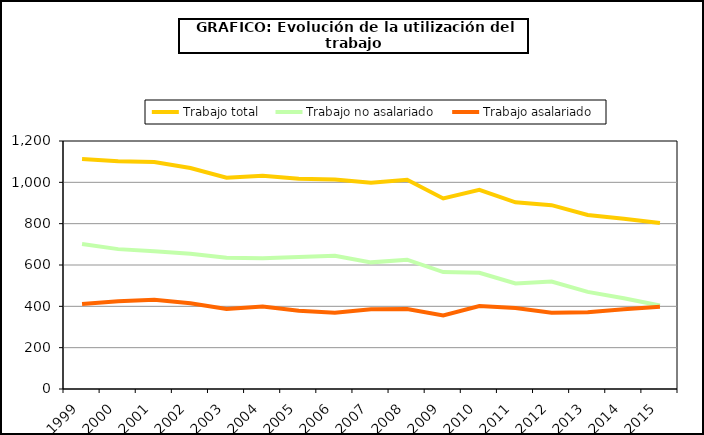
| Category | Trabajo total | Trabajo no asalariado | Trabajo asalariado |
|---|---|---|---|
| 1999.0 | 1112.739 | 701.172 | 411.567 |
| 2000.0 | 1101.451 | 676.79 | 424.661 |
| 2001.0 | 1098.738 | 666.463 | 432.275 |
| 2002.0 | 1069.314 | 654.029 | 415.285 |
| 2003.0 | 1022.665 | 635.076 | 387.589 |
| 2004.0 | 1032.156 | 632.785 | 399.371 |
| 2005.0 | 1017.234 | 638.883 | 378.351 |
| 2006.0 | 1013.286 | 644.545 | 368.741 |
| 2007.0 | 998.234 | 612.743 | 385.491 |
| 2008.0 | 1012.396 | 625.532 | 386.864 |
| 2009.0 | 922.026 | 565.965 | 356.062 |
| 2010.0 | 963.769 | 562.528 | 401.241 |
| 2011.0 | 903.306 | 510.941 | 392.364 |
| 2012.0 | 889.651 | 520.158 | 369.493 |
| 2013.0 | 841.68 | 470.11 | 371.57 |
| 2014.0 | 824.28 | 438.72 | 385.56 |
| 2015.0 | 802.786 | 404.421 | 398.366 |